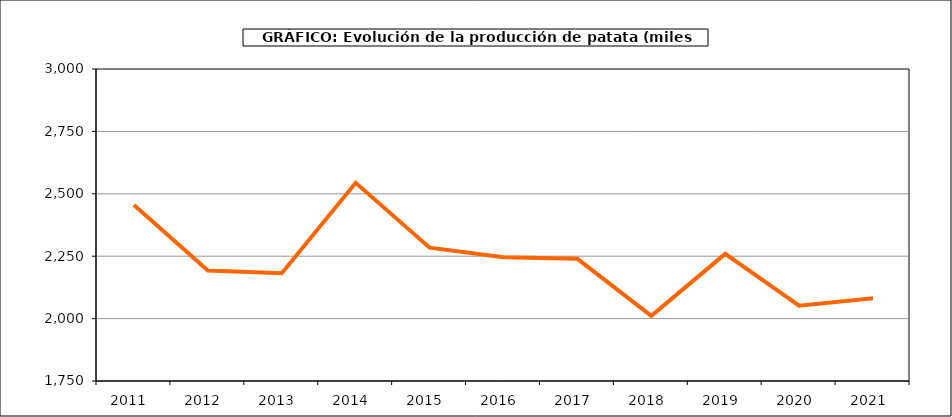
| Category | Producción |
|---|---|
| 2011.0 | 2455.101 |
| 2012.0 | 2192.284 |
| 2013.0 | 2182.082 |
| 2014.0 | 2544.009 |
| 2015.0 | 2284.073 |
| 2016.0 | 2246.204 |
| 2017.0 | 2239.47 |
| 2018.0 | 2010.933 |
| 2019.0 | 2259.32 |
| 2020.0 | 2051.833 |
| 2021.0 | 2081.106 |